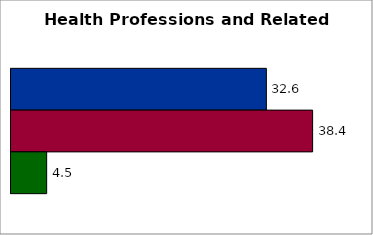
| Category | 50 states and D.C. | SREB states | State |
|---|---|---|---|
| 0 | 32.555 | 38.45 | 4.545 |